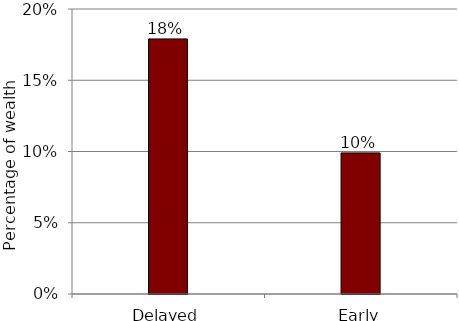
| Category | Series 0 |
|---|---|
| Delayed | 0.179 |
| Early | 0.099 |